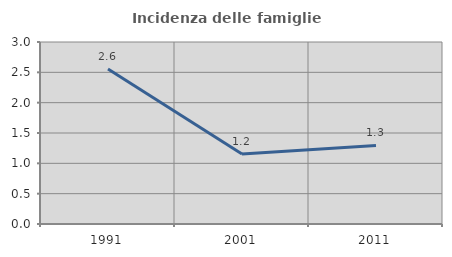
| Category | Incidenza delle famiglie numerose |
|---|---|
| 1991.0 | 2.556 |
| 2001.0 | 1.153 |
| 2011.0 | 1.295 |